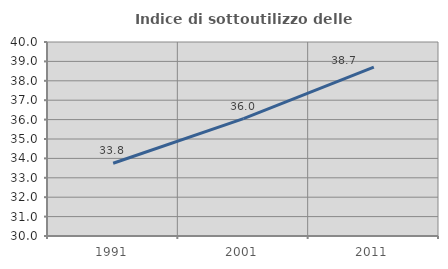
| Category | Indice di sottoutilizzo delle abitazioni  |
|---|---|
| 1991.0 | 33.75 |
| 2001.0 | 36.049 |
| 2011.0 | 38.704 |